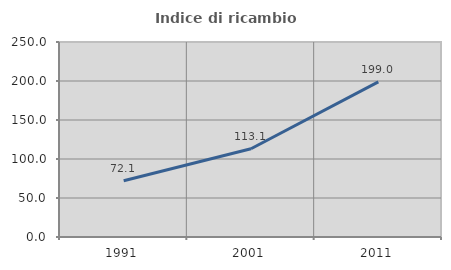
| Category | Indice di ricambio occupazionale  |
|---|---|
| 1991.0 | 72.146 |
| 2001.0 | 113.115 |
| 2011.0 | 198.964 |